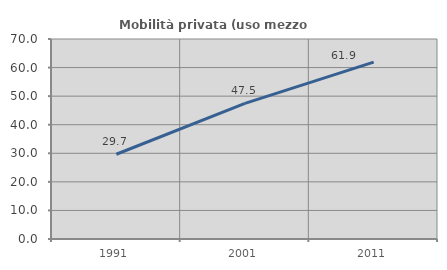
| Category | Mobilità privata (uso mezzo privato) |
|---|---|
| 1991.0 | 29.659 |
| 2001.0 | 47.489 |
| 2011.0 | 61.914 |